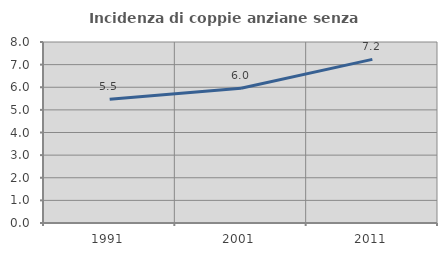
| Category | Incidenza di coppie anziane senza figli  |
|---|---|
| 1991.0 | 5.468 |
| 2001.0 | 5.96 |
| 2011.0 | 7.231 |